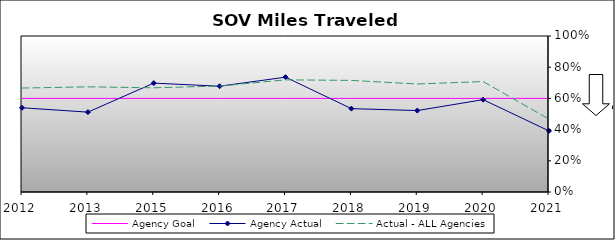
| Category | Agency Goal | Agency Actual | Actual - ALL Agencies |
|---|---|---|---|
| 2012.0 | 0.6 | 0.54 | 0.666 |
| 2013.0 | 0.6 | 0.512 | 0.674 |
| 2015.0 | 0.6 | 0.698 | 0.668 |
| 2016.0 | 0.6 | 0.678 | 0.679 |
| 2017.0 | 0.6 | 0.736 | 0.719 |
| 2018.0 | 0.6 | 0.534 | 0.715 |
| 2019.0 | 0.6 | 0.522 | 0.692 |
| 2020.0 | 0.6 | 0.592 | 0.708 |
| 2021.0 | 0.6 | 0.392 | 0.467 |